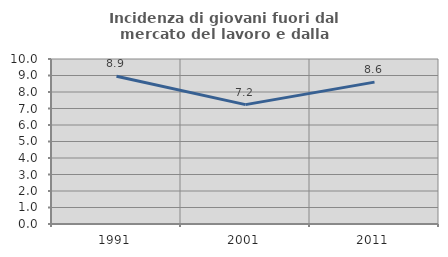
| Category | Incidenza di giovani fuori dal mercato del lavoro e dalla formazione  |
|---|---|
| 1991.0 | 8.949 |
| 2001.0 | 7.234 |
| 2011.0 | 8.597 |